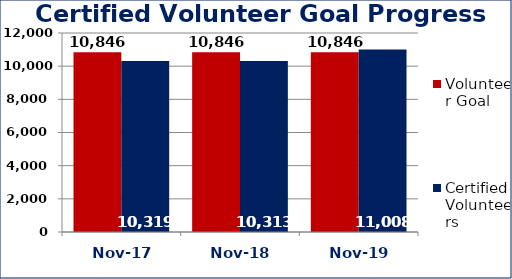
| Category | Volunteer Goal  | Certified Volunteers  |
|---|---|---|
| Nov-17 | 10846 | 10319 |
| Nov-18 | 10846 | 10313 |
| Nov-19 | 10846 | 11008 |